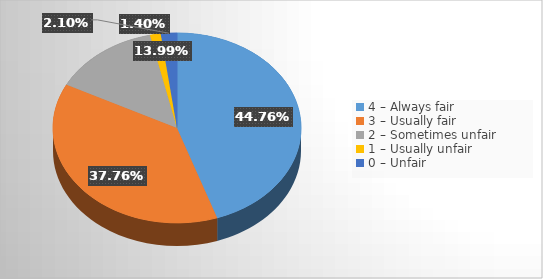
| Category | Series 0 |
|---|---|
| 4 – Always fair                                | 0.448 |
| 3 – Usually fair                    | 0.378 |
| 2 – Sometimes unfair                       | 0.14 |
| 1 – Usually unfair                       | 0.014 |
| 0 – Unfair             | 0.021 |